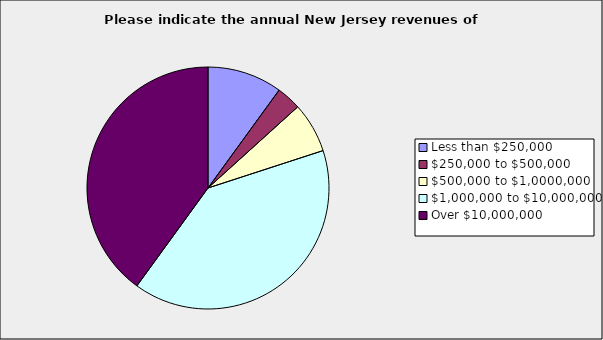
| Category | Series 0 |
|---|---|
| Less than $250,000 | 0.1 |
| $250,000 to $500,000 | 0.033 |
| $500,000 to $1,0000,000 | 0.067 |
| $1,000,000 to $10,000,000 | 0.4 |
| Over $10,000,000 | 0.4 |